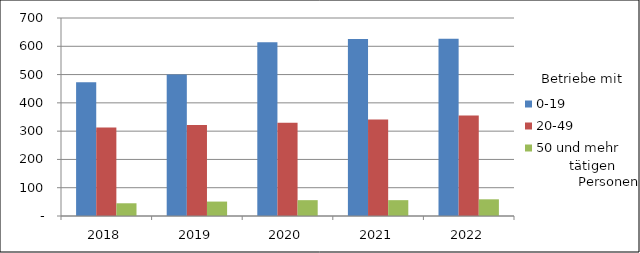
| Category | 0-19 | 20-49 | 50 und mehr |
|---|---|---|---|
| 2018.0 | 473 | 313 | 45 |
| 2019.0 | 500 | 322 | 51 |
| 2020.0 | 614 | 330 | 56 |
| 2021.0 | 626 | 341 | 56 |
| 2022.0 | 627 | 355 | 59 |